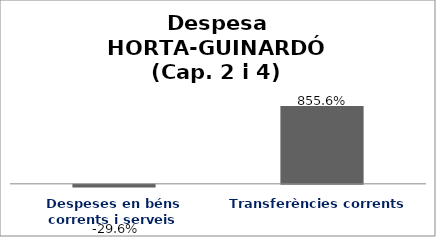
| Category | Series 0 |
|---|---|
| Despeses en béns corrents i serveis | -0.296 |
| Transferències corrents | 8.556 |